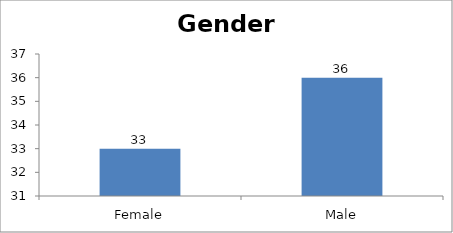
| Category | Gender |
|---|---|
| Female | 33 |
| Male | 36 |